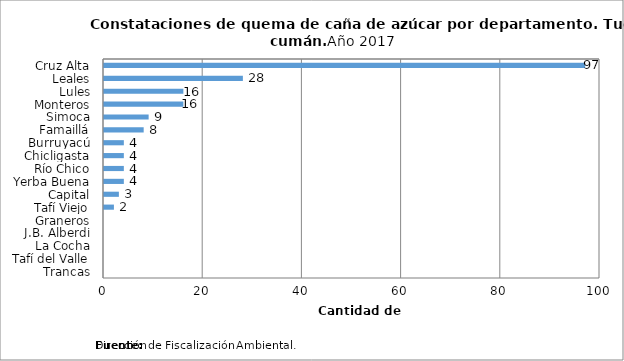
| Category | Constataciones |
|---|---|
| Cruz Alta | 97 |
| Leales | 28 |
| Lules | 16 |
| Monteros | 16 |
| Simoca | 9 |
| Famaillá | 8 |
| Burruyacú | 4 |
| Chicligasta | 4 |
| Río Chico | 4 |
| Yerba Buena | 4 |
| Capital | 3 |
| Tafí Viejo | 2 |
| Graneros | 0 |
| J.B. Alberdi | 0 |
| La Cocha | 0 |
| Tafí del Valle | 0 |
| Trancas | 0 |